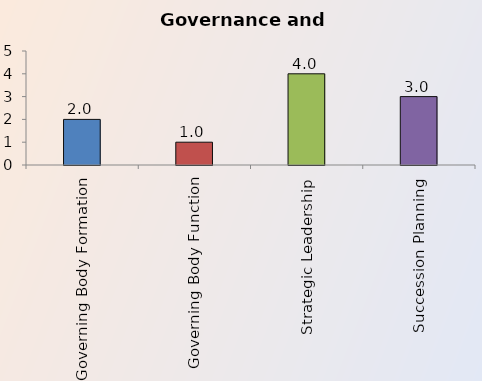
| Category | Series 0 |
|---|---|
| Governing Body Formation | 2 |
| Governing Body Function | 1 |
| Strategic Leadership | 4 |
| Succession Planning | 3 |